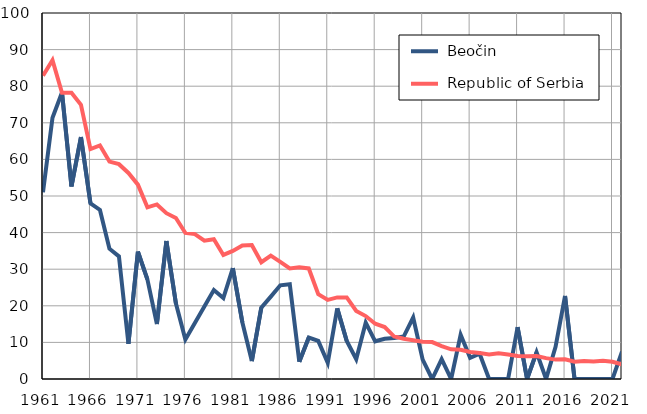
| Category |  Beočin |  Republic of Serbia |
|---|---|---|
| 1961.0 | 51 | 82.9 |
| 1962.0 | 71.4 | 87.1 |
| 1963.0 | 78.3 | 78.2 |
| 1964.0 | 52.6 | 78.2 |
| 1965.0 | 66.1 | 74.9 |
| 1966.0 | 48 | 62.8 |
| 1967.0 | 46.2 | 63.8 |
| 1968.0 | 35.6 | 59.4 |
| 1969.0 | 33.5 | 58.7 |
| 1970.0 | 9.6 | 56.3 |
| 1971.0 | 34.8 | 53.1 |
| 1972.0 | 27.2 | 46.9 |
| 1973.0 | 15 | 47.7 |
| 1974.0 | 37.7 | 45.3 |
| 1975.0 | 20.7 | 44 |
| 1976.0 | 10.8 | 39.9 |
| 1977.0 | 15.3 | 39.6 |
| 1978.0 | 19.8 | 37.8 |
| 1979.0 | 24.3 | 38.2 |
| 1980.0 | 22.1 | 33.9 |
| 1981.0 | 30.3 | 35 |
| 1982.0 | 15.5 | 36.5 |
| 1983.0 | 4.9 | 36.6 |
| 1984.0 | 19.5 | 31.9 |
| 1985.0 | 22.5 | 33.7 |
| 1986.0 | 25.6 | 32 |
| 1987.0 | 25.9 | 30.2 |
| 1988.0 | 4.7 | 30.5 |
| 1989.0 | 11.3 | 30.2 |
| 1990.0 | 10.4 | 23.2 |
| 1991.0 | 4.4 | 21.6 |
| 1992.0 | 19.3 | 22.3 |
| 1993.0 | 10.4 | 22.3 |
| 1994.0 | 5.4 | 18.6 |
| 1995.0 | 15.4 | 17.2 |
| 1996.0 | 10.3 | 15.1 |
| 1997.0 | 11 | 14.2 |
| 1998.0 | 11.2 | 11.6 |
| 1999.0 | 11.6 | 11 |
| 2000.0 | 16.8 | 10.6 |
| 2001.0 | 5.3 | 10.2 |
| 2002.0 | 0 | 10.1 |
| 2003.0 | 5.4 | 9 |
| 2004.0 | 0 | 8.1 |
| 2005.0 | 12.1 | 8 |
| 2006.0 | 5.8 | 7.4 |
| 2007.0 | 6.9 | 7.1 |
| 2008.0 | 0 | 6.7 |
| 2009.0 | 0 | 7 |
| 2010.0 | 0 | 6.7 |
| 2011.0 | 14.2 | 6.3 |
| 2012.0 | 0 | 6.2 |
| 2013.0 | 7.3 | 6.3 |
| 2014.0 | 0 | 5.7 |
| 2015.0 | 8.8 | 5.3 |
| 2016.0 | 22.7 | 5.4 |
| 2017.0 | 0 | 4.7 |
| 2018.0 | 0 | 4.9 |
| 2019.0 | 0 | 4.8 |
| 2020.0 | 0 | 5 |
| 2021.0 | 0 | 4.7 |
| 2022.0 | 7.5 | 4 |